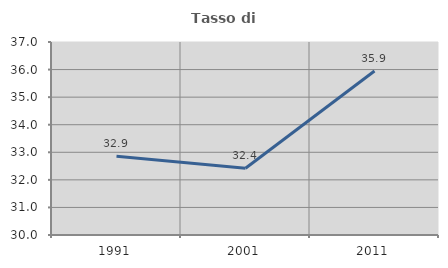
| Category | Tasso di occupazione   |
|---|---|
| 1991.0 | 32.855 |
| 2001.0 | 32.421 |
| 2011.0 | 35.95 |